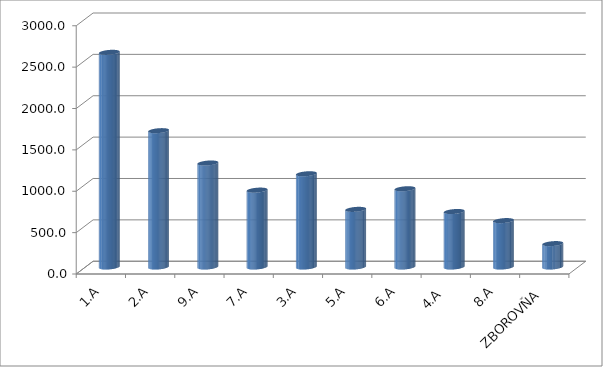
| Category | Series 0 |
|---|---|
| 1.A | 2594 |
| 2.A | 1647.5 |
| 9.A | 1256.5 |
| 7.A | 929 |
| 3.A | 1126.5 |
| 5.A | 696.5 |
| 6.A | 945.5 |
| 4.A  | 670.5 |
| 8.A | 560.5 |
| ZBOROVŇA | 282.5 |